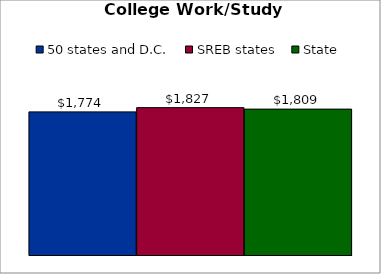
| Category | 50 states and D.C. | SREB states | State |
|---|---|---|---|
| 0 | 1774.233 | 1826.882 | 1808.539 |